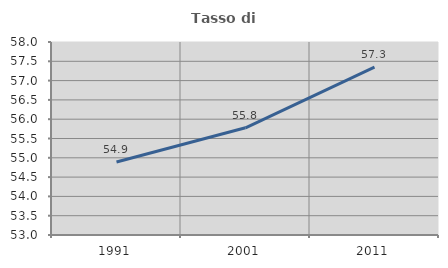
| Category | Tasso di occupazione   |
|---|---|
| 1991.0 | 54.892 |
| 2001.0 | 55.778 |
| 2011.0 | 57.348 |